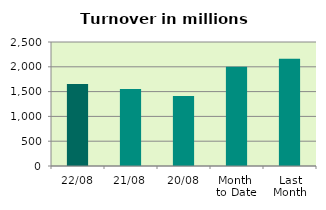
| Category | Series 0 |
|---|---|
| 22/08 | 1653.481 |
| 21/08 | 1554.008 |
| 20/08 | 1409.749 |
| Month 
to Date | 2001.052 |
| Last
Month | 2159.874 |